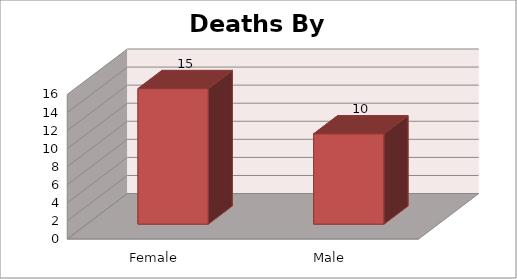
| Category | Series 0 |
|---|---|
| Female | 15 |
| Male | 10 |